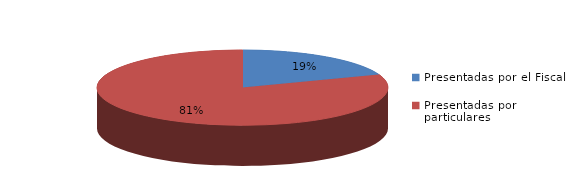
| Category | Series 0 |
|---|---|
| Presentadas por el Fiscal | 69 |
| Presentadas por particulares | 288 |